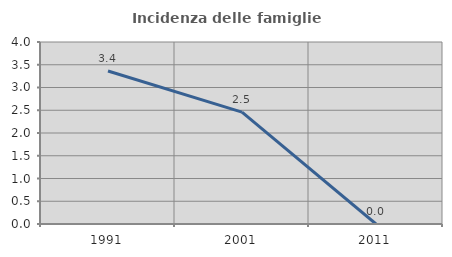
| Category | Incidenza delle famiglie numerose |
|---|---|
| 1991.0 | 3.361 |
| 2001.0 | 2.459 |
| 2011.0 | 0 |